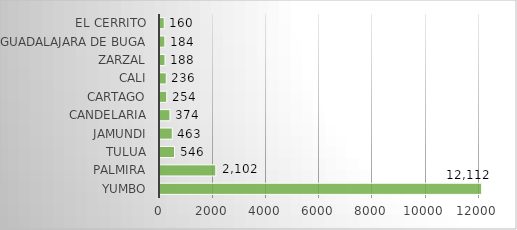
| Category | Series 0 |
|---|---|
| Yumbo | 12111.935 |
| Palmira | 2101.921 |
| Tulua | 546.111 |
| Jamundi | 463.044 |
| Candelaria | 373.605 |
| Cartago | 253.889 |
| Cali | 236.48 |
| Zarzal | 188.448 |
| Guadalajara De Buga | 183.606 |
| El Cerrito | 160.451 |